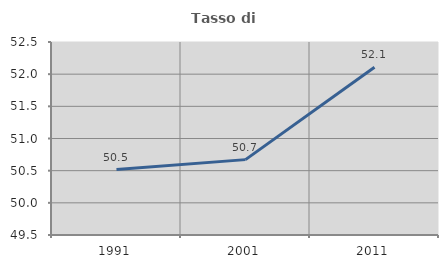
| Category | Tasso di occupazione   |
|---|---|
| 1991.0 | 50.517 |
| 2001.0 | 50.672 |
| 2011.0 | 52.107 |